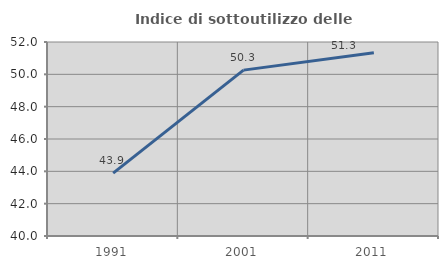
| Category | Indice di sottoutilizzo delle abitazioni  |
|---|---|
| 1991.0 | 43.893 |
| 2001.0 | 50.26 |
| 2011.0 | 51.339 |